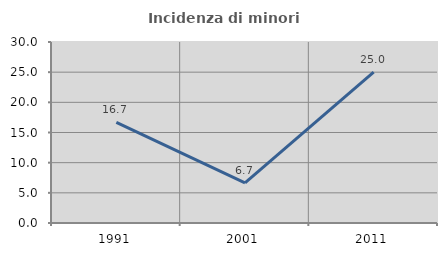
| Category | Incidenza di minori stranieri |
|---|---|
| 1991.0 | 16.667 |
| 2001.0 | 6.667 |
| 2011.0 | 25 |